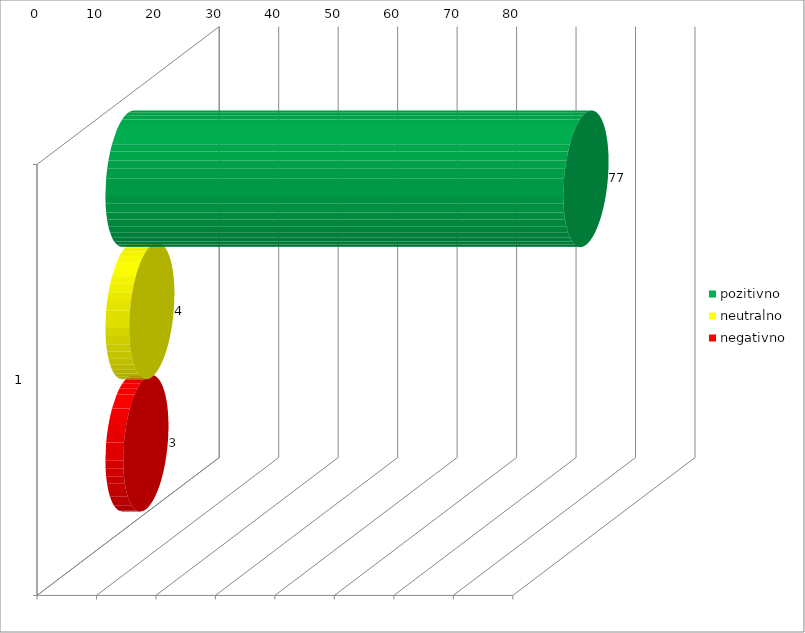
| Category | pozitivno | neutralno | negativno |
|---|---|---|---|
| 0 | 77 | 4 | 3 |